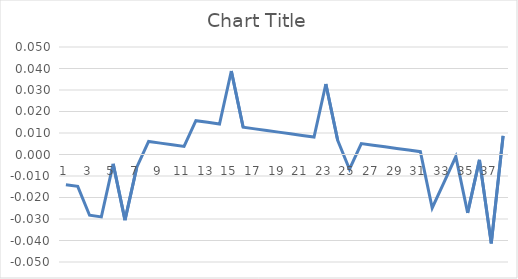
| Category | Series 0 |
|---|---|
| 0 | -0.014 |
| 1 | -0.015 |
| 2 | -0.028 |
| 3 | -0.029 |
| 4 | -0.004 |
| 5 | -0.031 |
| 6 | -0.006 |
| 7 | 0.006 |
| 8 | 0.005 |
| 9 | 0.005 |
| 10 | 0.004 |
| 11 | 0.016 |
| 12 | 0.015 |
| 13 | 0.014 |
| 14 | 0.039 |
| 15 | 0.013 |
| 16 | 0.012 |
| 17 | 0.011 |
| 18 | 0.01 |
| 19 | 0.01 |
| 20 | 0.009 |
| 21 | 0.008 |
| 22 | 0.033 |
| 23 | 0.007 |
| 24 | -0.007 |
| 25 | 0.005 |
| 26 | 0.004 |
| 27 | 0.004 |
| 28 | 0.003 |
| 29 | 0.002 |
| 30 | 0.001 |
| 31 | -0.025 |
| 32 | -0.013 |
| 33 | -0.001 |
| 34 | -0.027 |
| 35 | -0.002 |
| 36 | -0.041 |
| 37 | 0.009 |